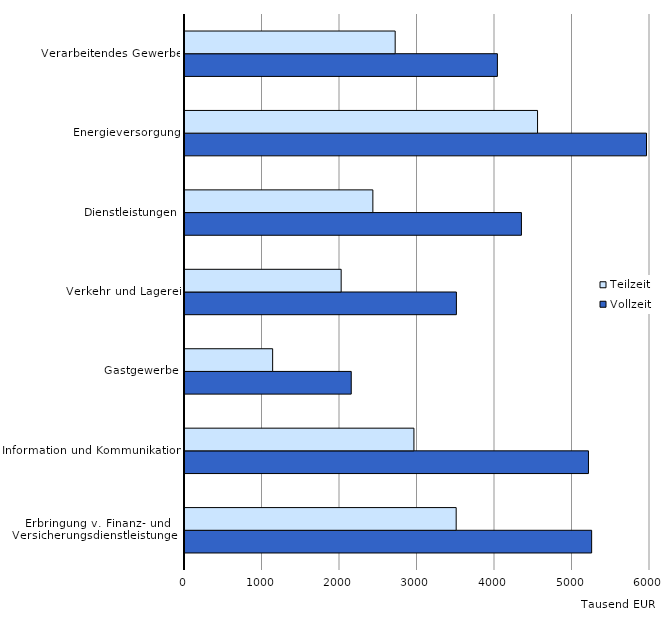
| Category | Vollzeit | Teilzeit |
|---|---|---|
| Erbringung v. Finanz- und Versicherungsdienstleistungen | 5247 | 3499 |
| Information und Kommunikation | 5206 | 2954 |
| Gastgewerbe | 2145 | 1131 |
| Verkehr und Lagerei | 3502 | 2015 |
| Dienstleistungen | 4341 | 2424 |
| Energieversorgung | 5955 | 4549 |
| Verarbeitendes Gewerbe | 4031 | 2712 |